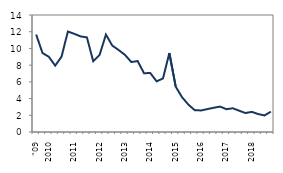
| Category | median |
|---|---|
| "09 | 11.66 |
|  | 9.45 |
| 2010 | 9 |
|  | 7.94 |
|  | 9.01 |
|  | 12.02 |
| 2011 | 11.75 |
|  | 11.44 |
|  | 11.32 |
|  | 8.46 |
| 2012 | 9.23 |
|  | 11.66 |
|  | 10.34 |
|  | 9.81 |
| 2013 | 9.23 |
|  | 8.37 |
|  | 8.49 |
|  | 7.04 |
| 2014 | 7.05 |
|  | 6.06 |
|  | 6.41 |
|  | 9.45 |
| 2015 | 5.43 |
|  | 4.16 |
|  | 3.28 |
|  | 2.61 |
| 2016 | 2.58 |
|  | 2.74 |
|  | 2.9 |
|  | 3.04 |
| 2017 | 2.73 |
|  | 2.84 |
|  | 2.55 |
|  | 2.27 |
| 2018 | 2.41 |